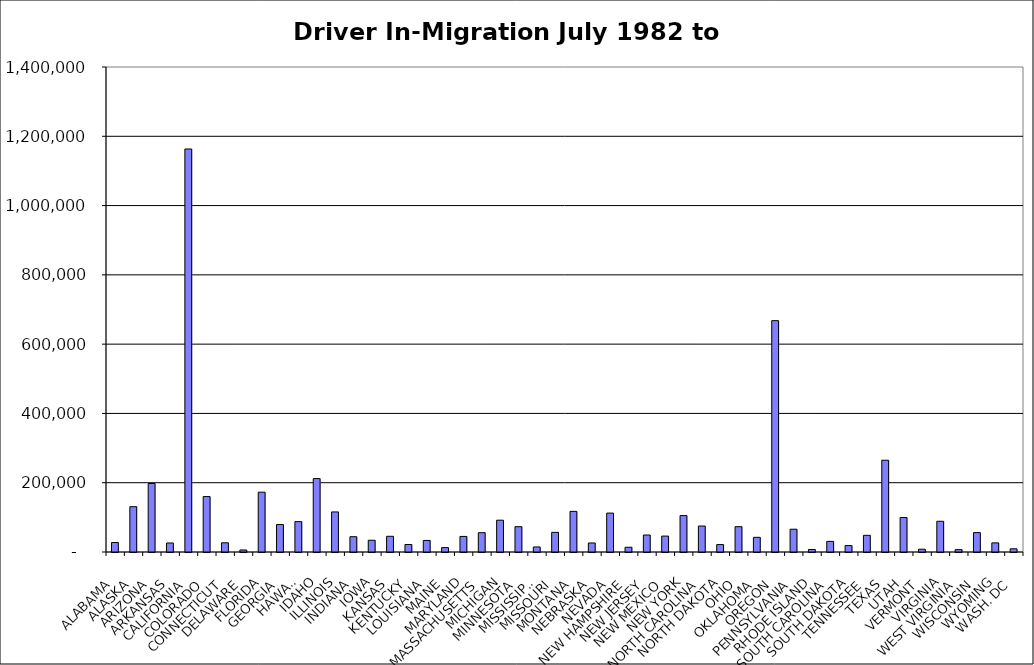
| Category | Series 0 |
|---|---|
| ALABAMA | 27338.5 |
| ALASKA | 130818.5 |
| ARIZONA | 197743 |
| ARKANSAS | 26018.5 |
| CALIFORNIA | 1163301.5 |
| COLORADO | 160010 |
| CONNECTICUT | 26578 |
| DELAWARE | 5852.5 |
| FLORIDA | 172658 |
| GEORGIA | 79315 |
| HAWAII | 87711.5 |
| IDAHO | 211905.5 |
| ILLINOIS | 115655.5 |
| INDIANA | 44129 |
| IOWA | 33937.5 |
| KANSAS | 45357.5 |
| KENTUCKY | 21657 |
| LOUISIANA | 33332.5 |
| MAINE | 12636.5 |
| MARYLAND | 44957 |
| MASSACHUSETTS | 55719 |
| MICHIGAN | 91827 |
| MINNESOTA | 73063.5 |
| MISSISSIPPI | 14541 |
| MISSOURI | 56662 |
| MONTANA | 117247 |
| NEBRASKA | 26057.5 |
| NEVADA | 112310 |
| NEW HAMPSHIRE | 13706.5 |
| NEW JERSEY | 49050 |
| NEW MEXICO | 45938 |
| NEW YORK | 105113 |
| NORTH CAROLINA | 75000.5 |
| NORTH DAKOTA | 21437.5 |
| OHIO | 73085.5 |
| OKLAHOMA | 42319 |
| OREGON | 667822 |
| PENNSYLVANIA | 65787.5 |
| RHODE ISLAND | 7221 |
| SOUTH CAROLINA | 30696.5 |
| SOUTH DAKOTA | 18495.5 |
| TENNESSEE | 48100.5 |
| TEXAS | 264846 |
| UTAH | 99481.5 |
| VERMONT | 8067 |
| VIRGINIA | 88707 |
| WEST VIRGINIA | 6814.5 |
| WISCONSIN | 56008.5 |
| WYOMING | 26356 |
| WASH. DC | 9285 |